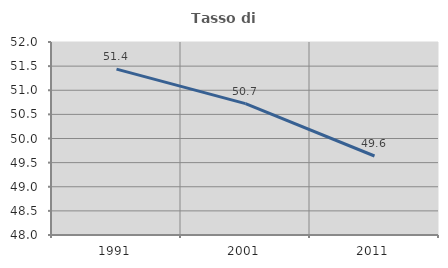
| Category | Tasso di occupazione   |
|---|---|
| 1991.0 | 51.439 |
| 2001.0 | 50.723 |
| 2011.0 | 49.637 |